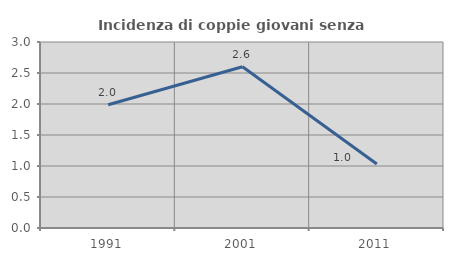
| Category | Incidenza di coppie giovani senza figli |
|---|---|
| 1991.0 | 1.989 |
| 2001.0 | 2.601 |
| 2011.0 | 1.031 |